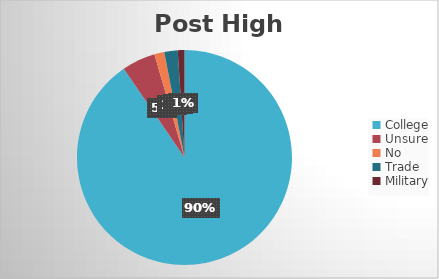
| Category | Series 0 |
|---|---|
| College | 180 |
| Unsure | 10 |
| No | 3 |
| Trade | 4 |
| Military | 2 |